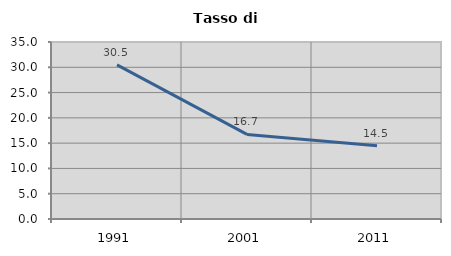
| Category | Tasso di disoccupazione   |
|---|---|
| 1991.0 | 30.462 |
| 2001.0 | 16.727 |
| 2011.0 | 14.488 |